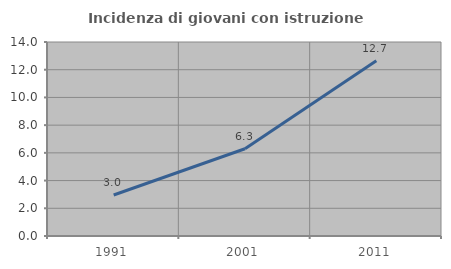
| Category | Incidenza di giovani con istruzione universitaria |
|---|---|
| 1991.0 | 2.958 |
| 2001.0 | 6.297 |
| 2011.0 | 12.651 |